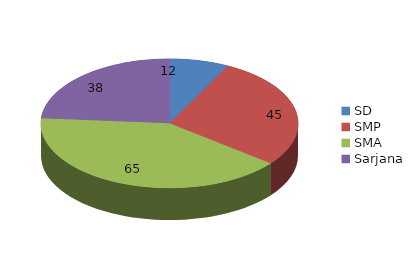
| Category | Series 0 |
|---|---|
| SD | 12 |
| SMP | 45 |
| SMA | 65 |
| Sarjana | 38 |